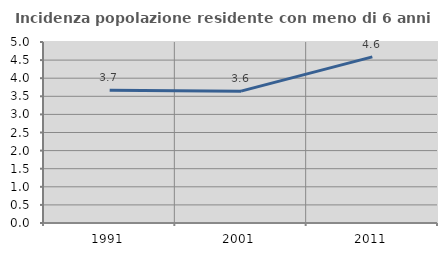
| Category | Incidenza popolazione residente con meno di 6 anni |
|---|---|
| 1991.0 | 3.664 |
| 2001.0 | 3.642 |
| 2011.0 | 4.588 |